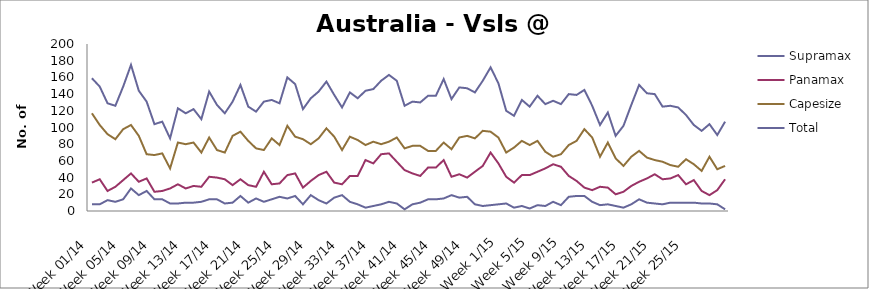
| Category | Supramax | Panamax | Capesize | Total |
|---|---|---|---|---|
| Week 01/14 | 8 | 34 | 117 | 159 |
| Week 02/14 | 8 | 38 | 103 | 149 |
| Week 03/14 | 13 | 24 | 92 | 129 |
| Week 04/14 | 11 | 29 | 86 | 126 |
| Week 05/14 | 14 | 37 | 98 | 149 |
| Week 06/14 | 27 | 45 | 103 | 175 |
| Week 07/14 | 19 | 35 | 90 | 144 |
| Week 08/14 | 24 | 39 | 68 | 131 |
| Week 09/14 | 14 | 23 | 67 | 104 |
| Week 10/14 | 14 | 24 | 69 | 107 |
| Week 11/14 | 9 | 27 | 51 | 87 |
| Week 12/14 | 9 | 32 | 82 | 123 |
| Week 13/14 | 10 | 27 | 80 | 117 |
| Week 14/14 | 10 | 30 | 82 | 122 |
| Week 15/14 | 11 | 29 | 70 | 110 |
| Week 16/14 | 14 | 41 | 88 | 143 |
| Week 17/14 | 14 | 40 | 73 | 127 |
| Week 18/14 | 9 | 38 | 70 | 117 |
| Week 19/14 | 10 | 31 | 90 | 131 |
| Week 20/14 | 18 | 38 | 95 | 151 |
| Week 21/14 | 10 | 31 | 84 | 125 |
| Week 22/14 | 15 | 29 | 75 | 119 |
| Week 23/14 | 11 | 47 | 73 | 131 |
| Week 24/14 | 14 | 32 | 87 | 133 |
| Week 25/14 | 17 | 33 | 79 | 129 |
| Week 26/14 | 15 | 43 | 102 | 160 |
| Week 27/14 | 18 | 45 | 89 | 152 |
| Week 28/14 | 8 | 28 | 86 | 122 |
| Week 29/14 | 19 | 36 | 80 | 135 |
| Week 30/14 | 13 | 43 | 87 | 143 |
| Week 31/14 | 9 | 47 | 99 | 155 |
| Week 32/14 | 16 | 34 | 89 | 139 |
| Week 33/14 | 19 | 32 | 73 | 124 |
| Week 34/14 | 11 | 42 | 89 | 142 |
| Week 35/14 | 8 | 42 | 85 | 135 |
| Week 36/14 | 4 | 61 | 79 | 144 |
| Week 37/14 | 6 | 57 | 83 | 146 |
| Week 38/14 | 8 | 68 | 80 | 156 |
| Week 39/14 | 11 | 69 | 83 | 163 |
| Week 40/14 | 9 | 59 | 88 | 156 |
| Week 41/14 | 2 | 49 | 75 | 126 |
| Week 42/14 | 8 | 45 | 78 | 131 |
| Week 43/14 | 10 | 42 | 78 | 130 |
| Week 44/14 | 14 | 52 | 72 | 138 |
| Week 45/14 | 14 | 52 | 72 | 138 |
| Week 46/14 | 15 | 61 | 82 | 158 |
| Week 47/14 | 19 | 41 | 74 | 134 |
| Week 48/14 | 16 | 44 | 88 | 148 |
| Week 49/14 | 17 | 40 | 90 | 147 |
| Week 50/14 | 8 | 47 | 87 | 142 |
| Week 51/14 | 6 | 54 | 96 | 156 |
| Week 52/14 | 7 | 70 | 95 | 172 |
| Week 1/15 | 8 | 57 | 88 | 153 |
| Week 2/15 | 9 | 41 | 70 | 120 |
| Week 3/15 | 4 | 34 | 76 | 114 |
| Week 4/15 | 6 | 43 | 84 | 133 |
| Week 5/15 | 3 | 43 | 79 | 125 |
| Week 6/15 | 7 | 47 | 84 | 138 |
| Week 7/15 | 6 | 51 | 71 | 128 |
| Week 8/15 | 11 | 56 | 65 | 132 |
| Week 9/15 | 7 | 53 | 68 | 128 |
| Week 10/15 | 17 | 42 | 79 | 140 |
| Week 11/15 | 18 | 36 | 84 | 139 |
| Week 12/15 | 18 | 28 | 98 | 145 |
| Week 13/15 | 11 | 25 | 88 | 126 |
| Week 14/15 | 7 | 29 | 65 | 103 |
| Week 15/15 | 8 | 28 | 82 | 118 |
| Week 16/15 | 6 | 20 | 63 | 90 |
| Week 17/15 | 4 | 23 | 54 | 102 |
| Week 18/15 | 8 | 30 | 65 | 127 |
| Week 19/15 | 14 | 35 | 72 | 151 |
| Week 20/15 | 10 | 39 | 64 | 141 |
| Week 21/15 | 9 | 44 | 61 | 140 |
| Week 22/15 | 8 | 38 | 59 | 125 |
| Week 23/15 | 10 | 39 | 55 | 126 |
| Week 24/15 | 10 | 43 | 53 | 124 |
| Week 25/15 | 10 | 32 | 62 | 115 |